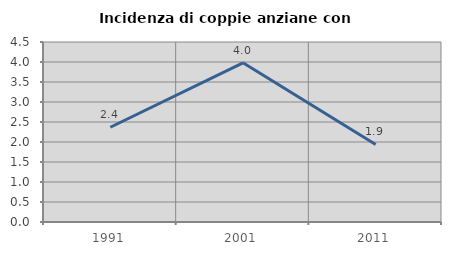
| Category | Incidenza di coppie anziane con figli |
|---|---|
| 1991.0 | 2.368 |
| 2001.0 | 3.98 |
| 2011.0 | 1.939 |